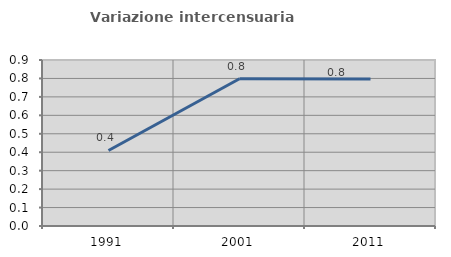
| Category | Variazione intercensuaria annua |
|---|---|
| 1991.0 | 0.41 |
| 2001.0 | 0.798 |
| 2011.0 | 0.797 |